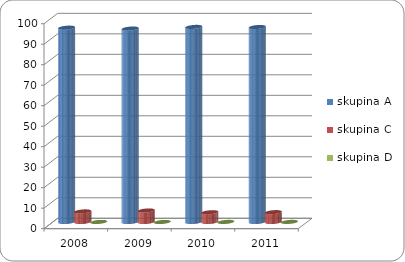
| Category | skupina A | skupina C | skupina D |
|---|---|---|---|
| 2008.0 | 94.82 | 5.16 | 0.02 |
| 2009.0 | 94.39 | 5.61 | 0 |
| 2010.0 | 95.19 | 4.76 | 0.05 |
| 2011.0 | 95.14 | 4.8 | 0.05 |